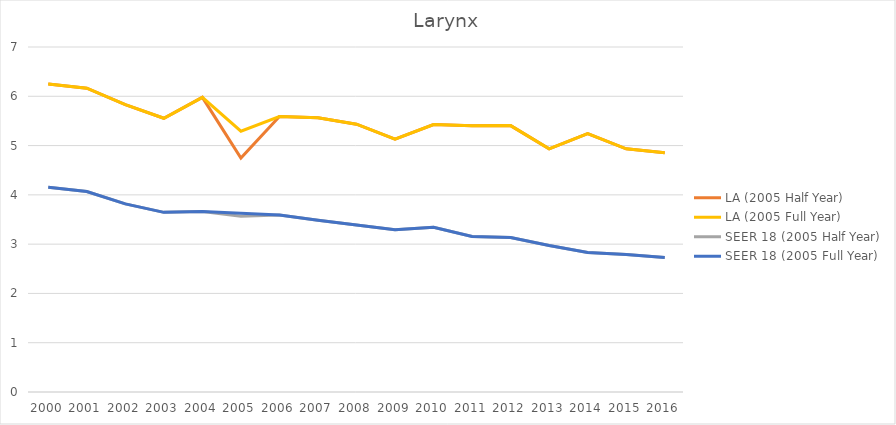
| Category | LA (2005 Half Year) | LA (2005 Full Year) | SEER 18 (2005 Half Year) | SEER 18 (2005 Full Year) |
|---|---|---|---|---|
| 2000.0 | 6.251 | 6.251 | 4.154 | 4.154 |
| 2001.0 | 6.164 | 6.164 | 4.067 | 4.067 |
| 2002.0 | 5.829 | 5.829 | 3.818 | 3.818 |
| 2003.0 | 5.554 | 5.554 | 3.645 | 3.645 |
| 2004.0 | 5.979 | 5.979 | 3.66 | 3.66 |
| 2005.0 | 4.746 | 5.291 | 3.566 | 3.628 |
| 2006.0 | 5.59 | 5.59 | 3.591 | 3.591 |
| 2007.0 | 5.563 | 5.563 | 3.484 | 3.484 |
| 2008.0 | 5.434 | 5.434 | 3.389 | 3.389 |
| 2009.0 | 5.129 | 5.129 | 3.292 | 3.292 |
| 2010.0 | 5.425 | 5.425 | 3.34 | 3.34 |
| 2011.0 | 5.403 | 5.403 | 3.157 | 3.157 |
| 2012.0 | 5.405 | 5.405 | 3.136 | 3.136 |
| 2013.0 | 4.934 | 4.934 | 2.971 | 2.971 |
| 2014.0 | 5.241 | 5.241 | 2.832 | 2.832 |
| 2015.0 | 4.935 | 4.935 | 2.789 | 2.789 |
| 2016.0 | 4.855 | 4.855 | 2.729 | 2.729 |